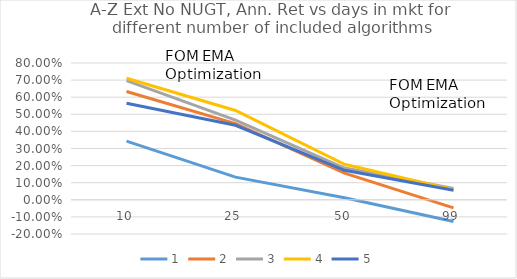
| Category | 1 | 2 | 3 | 4 | 5 |
|---|---|---|---|---|---|
| 10.0 | 0.343 | 0.633 | 0.697 | 0.711 | 0.564 |
| 25.0 | 0.132 | 0.446 | 0.466 | 0.522 | 0.436 |
| 50.0 | 0.013 | 0.156 | 0.186 | 0.208 | 0.172 |
| 99.0 | -0.127 | -0.047 | 0.067 | 0.058 | 0.056 |